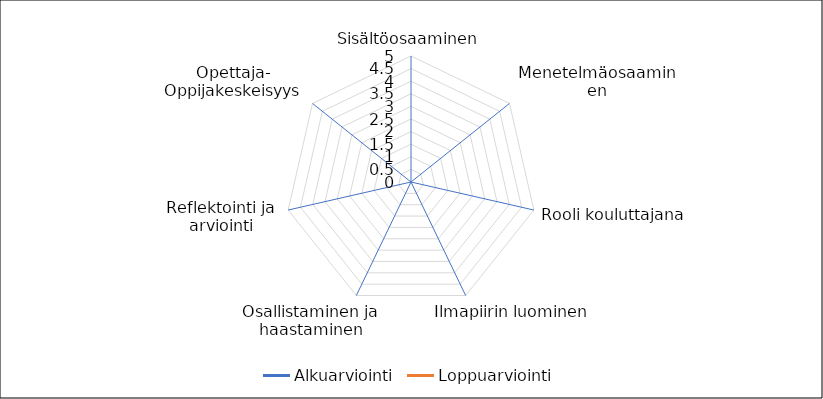
| Category | Alkuarviointi | Loppuarviointi |
|---|---|---|
| Sisältöosaaminen | 0 | 0 |
| Menetelmäosaaminen | 0 | 0 |
| Rooli kouluttajana | 0 | 0 |
| Ilmapiirin luominen | 0 | 0 |
| Osallistaminen ja haastaminen | 0 | 0 |
| Reflektointi ja arviointi | 0 | 0 |
| Opettaja- Oppijakeskeisyys | 0 | 0 |